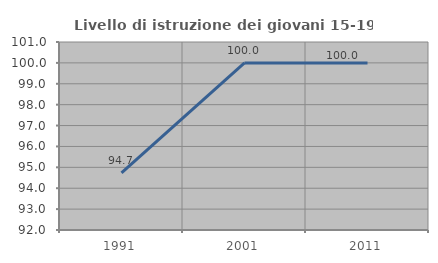
| Category | Livello di istruzione dei giovani 15-19 anni |
|---|---|
| 1991.0 | 94.737 |
| 2001.0 | 100 |
| 2011.0 | 100 |